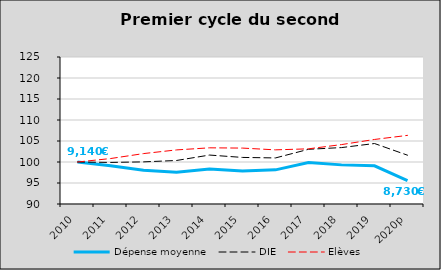
| Category | Dépense moyenne  | DIE  | Elèves |
|---|---|---|---|
| 2010 | 100 | 100 | 100 |
| 2011 | 99.085 | 99.898 | 100.821 |
| 2012 | 98.062 | 100.028 | 102.005 |
| 2013 | 97.556 | 100.362 | 102.876 |
| 2014 | 98.334 | 101.653 | 103.375 |
| 2015 | 97.846 | 101.087 | 103.312 |
| 2016 | 98.131 | 100.969 | 102.892 |
| 2017 | 99.889 | 103.022 | 103.136 |
| 2018 | 99.316 | 103.434 | 104.147 |
| 2019 | 99.082 | 104.4 | 105.367 |
| 2020p | 95.562 | 101.622 | 106.341 |